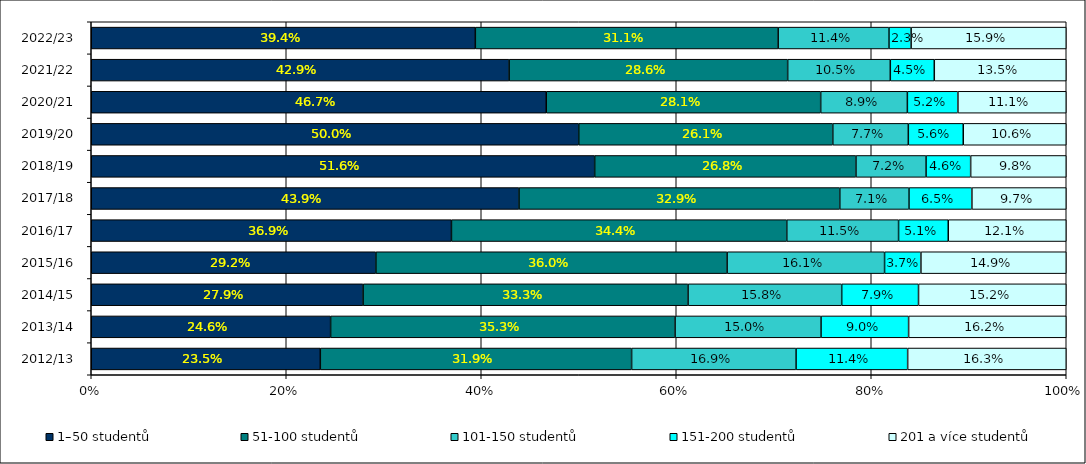
| Category | 1–50 studentů | 51-100 studentů | 101-150 studentů | 151-200 studentů | 201 a více studentů |
|---|---|---|---|---|---|
| 2012/13 | 0.235 | 0.319 | 0.169 | 0.114 | 0.163 |
| 2013/14 | 0.246 | 0.353 | 0.15 | 0.09 | 0.162 |
| 2014/15 | 0.279 | 0.333 | 0.158 | 0.079 | 0.152 |
| 2015/16 | 0.292 | 0.36 | 0.161 | 0.037 | 0.149 |
| 2016/17 | 0.369 | 0.344 | 0.115 | 0.051 | 0.121 |
| 2017/18 | 0.439 | 0.329 | 0.071 | 0.065 | 0.097 |
| 2018/19 | 0.516 | 0.268 | 0.072 | 0.046 | 0.098 |
| 2019/20 | 0.5 | 0.261 | 0.077 | 0.056 | 0.106 |
| 2020/21 | 0.467 | 0.281 | 0.089 | 0.052 | 0.111 |
| 2021/22 | 0.429 | 0.286 | 0.105 | 0.045 | 0.135 |
| 2022/23 | 0.394 | 0.311 | 0.114 | 0.023 | 0.159 |